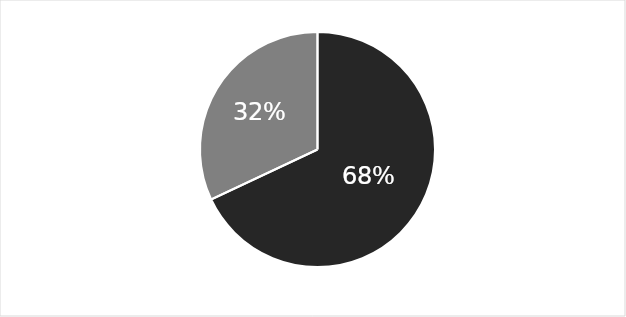
| Category | Series 0 |
|---|---|
| HOMBRE | 0.68 |
| MUJER | 0.32 |